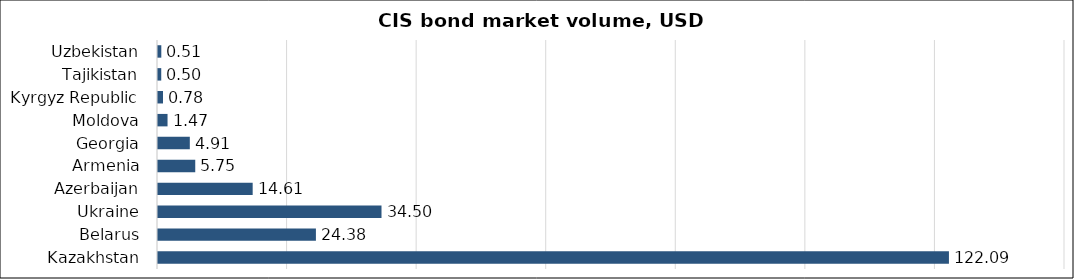
| Category | Series 0 |
|---|---|
| Kazakhstan | 122.085 |
| Belarus | 24.375 |
| Ukraine | 34.499 |
| Azerbaijan | 14.614 |
| Armenia | 5.75 |
| Georgia | 4.911 |
| Moldova | 1.473 |
| Kyrgyz Republic | 0.776 |
| Tajikistan | 0.5 |
| Uzbekistan | 0.511 |